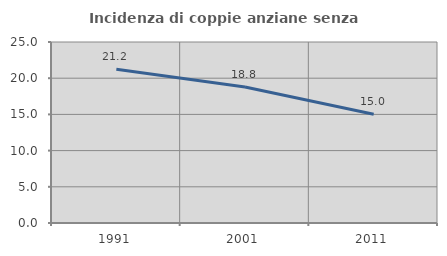
| Category | Incidenza di coppie anziane senza figli  |
|---|---|
| 1991.0 | 21.236 |
| 2001.0 | 18.794 |
| 2011.0 | 15.018 |